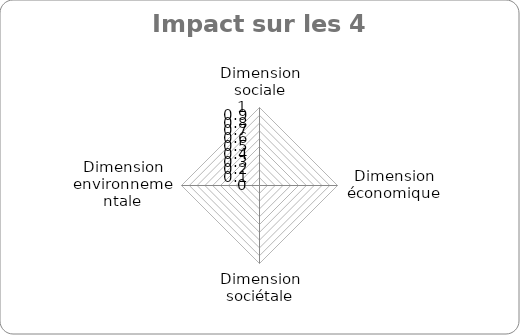
| Category | Series 0 |
|---|---|
| Dimension sociale | 0 |
| Dimension économique | 0 |
| Dimension sociétale | 0 |
| Dimension environnementale | 0 |